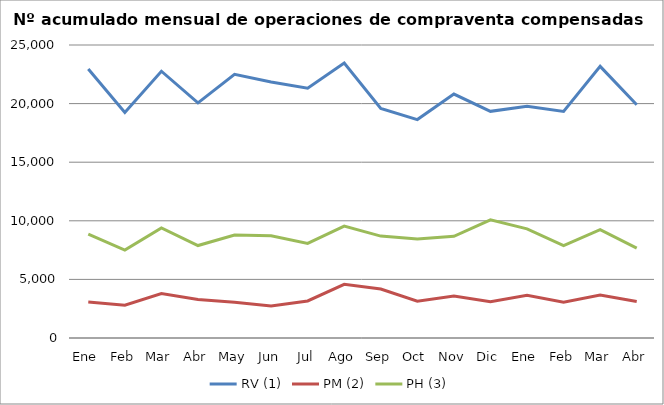
| Category | RV (1) | PM (2) | PH (3) |
|---|---|---|---|
| Ene | 22959 | 3062 | 8860 |
| Feb | 19239 | 2801 | 7496 |
| Mar | 22762 | 3799 | 9395 |
| Abr | 20064 | 3286 | 7887 |
| May | 22494 | 3044 | 8786 |
| Jun | 21845 | 2734 | 8729 |
| Jul | 21319 | 3159 | 8076 |
| Ago | 23457 | 4584 | 9551 |
| Sep | 19591 | 4178 | 8696 |
| Oct | 18637 | 3147 | 8437 |
| Nov | 20811 | 3581 | 8681 |
| Dic | 19338 | 3089 | 10080 |
| Ene | 19767 | 3643 | 9312 |
| Feb | 19336 | 3054 | 7889 |
| Mar | 23177 | 3671 | 9245 |
| Abr | 19898 | 3107 | 7671 |